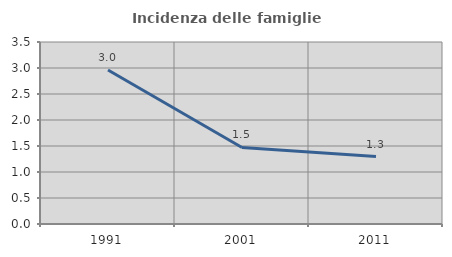
| Category | Incidenza delle famiglie numerose |
|---|---|
| 1991.0 | 2.96 |
| 2001.0 | 1.472 |
| 2011.0 | 1.297 |